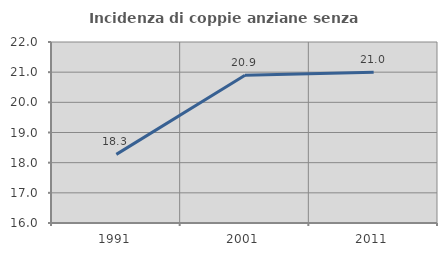
| Category | Incidenza di coppie anziane senza figli  |
|---|---|
| 1991.0 | 18.274 |
| 2001.0 | 20.896 |
| 2011.0 | 20.994 |